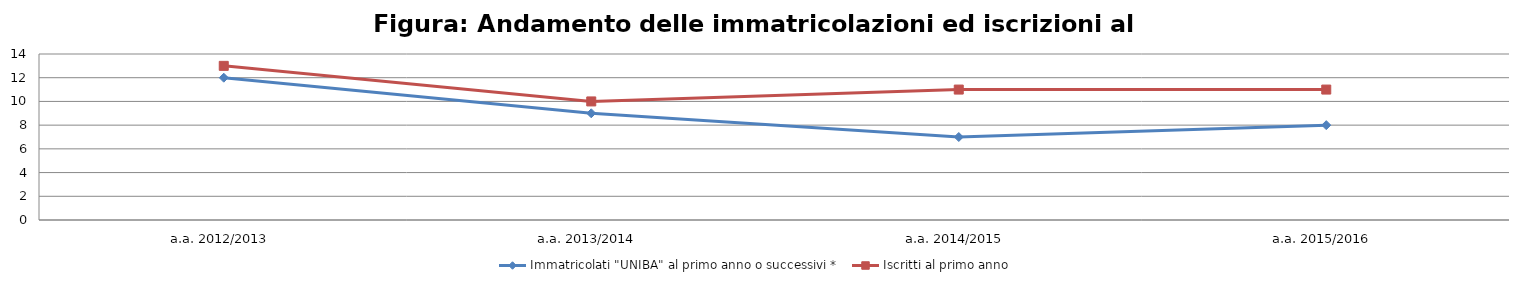
| Category | Immatricolati "UNIBA" al primo anno o successivi * | Iscritti al primo anno  |
|---|---|---|
| a.a. 2012/2013 | 12 | 13 |
| a.a. 2013/2014 | 9 | 10 |
| a.a. 2014/2015 | 7 | 11 |
| a.a. 2015/2016 | 8 | 11 |